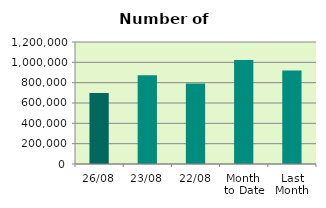
| Category | Series 0 |
|---|---|
| 26/08 | 698140 |
| 23/08 | 874002 |
| 22/08 | 792256 |
| Month 
to Date | 1022141.111 |
| Last
Month | 919173.478 |